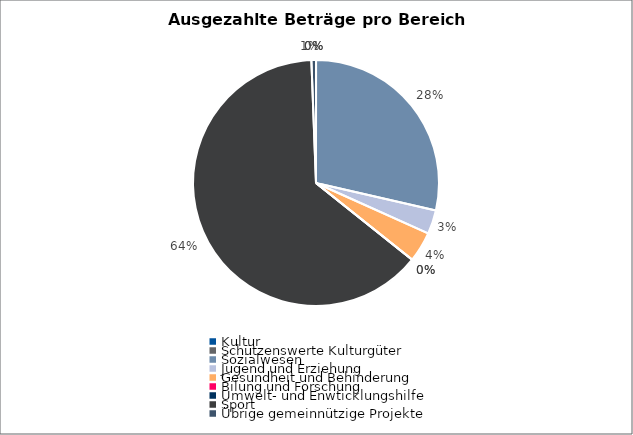
| Category | Series 0 |
|---|---|
| Kultur | 0 |
| Schützenswerte Kulturgüter | 0 |
| Sozialwesen | 2006724.6 |
| Jugend und Erziehung | 220751.75 |
| Gesundheit und Behinderung | 280348.4 |
| Bilung und Forschung | 0 |
| Umwelt- und Enwticklungshilfe | 0 |
| Sport | 4471705.53 |
| Übrige gemeinnützige Projekte | 42995.55 |